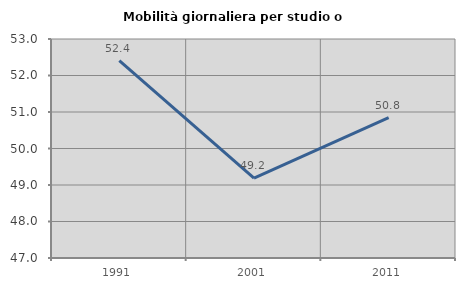
| Category | Mobilità giornaliera per studio o lavoro |
|---|---|
| 1991.0 | 52.41 |
| 2001.0 | 49.185 |
| 2011.0 | 50.843 |